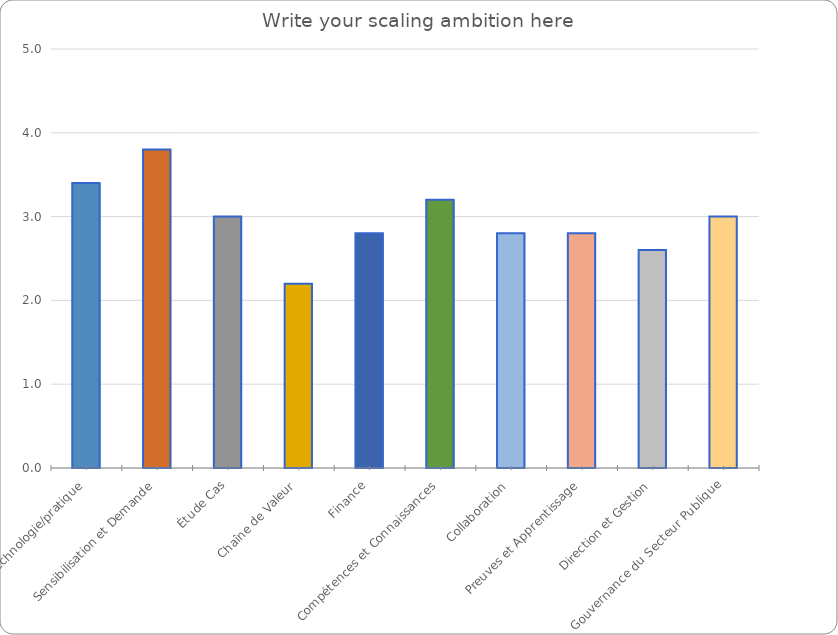
| Category | Series 0 |
|---|---|
| Technologie/pratique | 3.4 |
| Sensibilisation et Demande | 3.8 |
| Étude Cas | 3 |
| Chaîne de Valeur | 2.2 |
| Finance | 2.8 |
| Compétences et Connaissances | 3.2 |
| Collaboration | 2.8 |
| Preuves et Apprentissage | 2.8 |
| Direction et Gestion | 2.6 |
| Gouvernance du Secteur Publique | 3 |